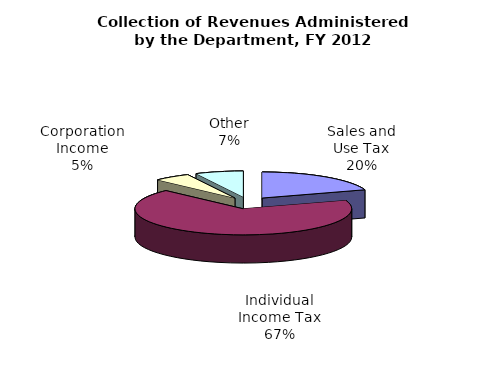
| Category | Series 0 |
|---|---|
| Sales and Use Tax | 3121503000 |
| Individual Income Tax | 10612836000 |
| Corporation Income | 859923000 |
| Other | 1130814000 |